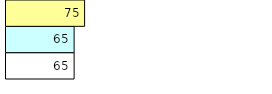
| Category | Total Standouts | Total Recd | Total Tipsters |
|---|---|---|---|
| 0 | 65 | 65 | 75 |